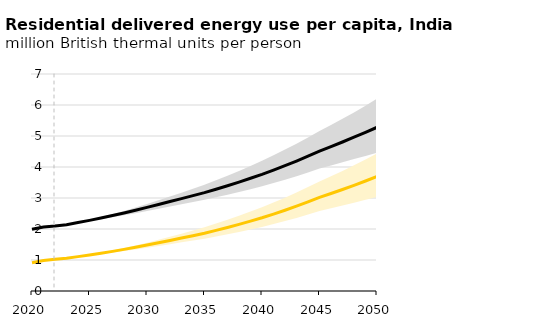
| Category | Residential |
|---|---|
| 2020.0 | 0.913 |
| 2021.0 | 0.983 |
| 2022.0 | 1.025 |
| 2023.0 | 1.058 |
| 2024.0 | 1.109 |
| 2025.0 | 1.161 |
| 2026.0 | 1.218 |
| 2027.0 | 1.278 |
| 2028.0 | 1.343 |
| 2029.0 | 1.412 |
| 2030.0 | 1.482 |
| 2031.0 | 1.556 |
| 2032.0 | 1.631 |
| 2033.0 | 1.708 |
| 2034.0 | 1.784 |
| 2035.0 | 1.862 |
| 2036.0 | 1.954 |
| 2037.0 | 2.05 |
| 2038.0 | 2.149 |
| 2039.0 | 2.253 |
| 2040.0 | 2.362 |
| 2041.0 | 2.48 |
| 2042.0 | 2.605 |
| 2043.0 | 2.736 |
| 2044.0 | 2.874 |
| 2045.0 | 3.018 |
| 2046.0 | 3.144 |
| 2047.0 | 3.275 |
| 2048.0 | 3.409 |
| 2049.0 | 3.548 |
| 2050.0 | 3.691 |